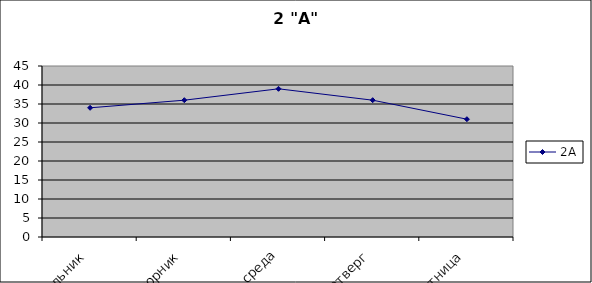
| Category | 2А |
|---|---|
| понедельник | 34 |
| вторник | 36 |
| среда | 39 |
| четверг | 36 |
| пятница | 31 |